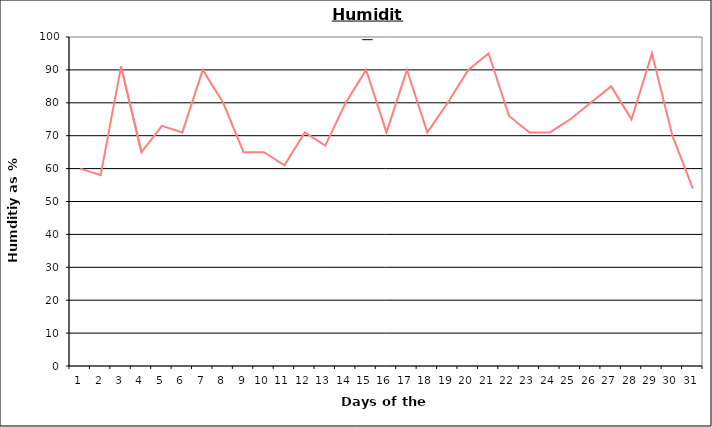
| Category | Series 0 |
|---|---|
| 0 | 60 |
| 1 | 58 |
| 2 | 91 |
| 3 | 65 |
| 4 | 73 |
| 5 | 71 |
| 6 | 90 |
| 7 | 80 |
| 8 | 65 |
| 9 | 65 |
| 10 | 61 |
| 11 | 71 |
| 12 | 67 |
| 13 | 80 |
| 14 | 90 |
| 15 | 71 |
| 16 | 90 |
| 17 | 71 |
| 18 | 80 |
| 19 | 90 |
| 20 | 95 |
| 21 | 76 |
| 22 | 71 |
| 23 | 71 |
| 24 | 75 |
| 25 | 80 |
| 26 | 85 |
| 27 | 75 |
| 28 | 95 |
| 29 | 70 |
| 30 | 54 |